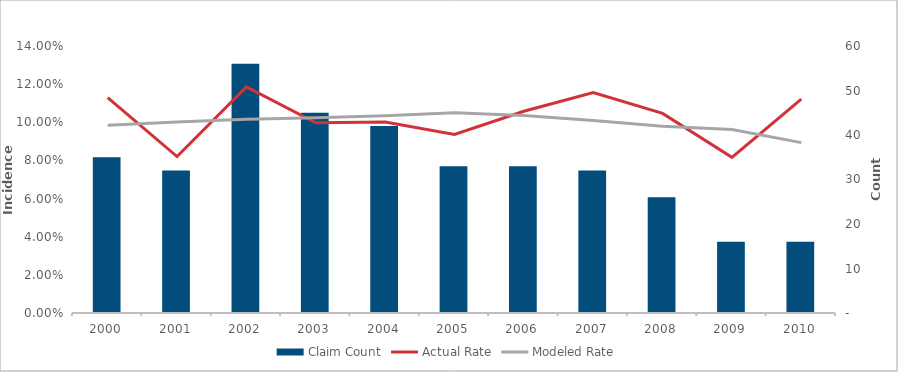
| Category | Claim Count |
|---|---|
| 2000.0 | 35 |
| 2001.0 | 32 |
| 2002.0 | 56 |
| 2003.0 | 45 |
| 2004.0 | 42 |
| 2005.0 | 33 |
| 2006.0 | 33 |
| 2007.0 | 32 |
| 2008.0 | 26 |
| 2009.0 | 16 |
| 2010.0 | 16 |